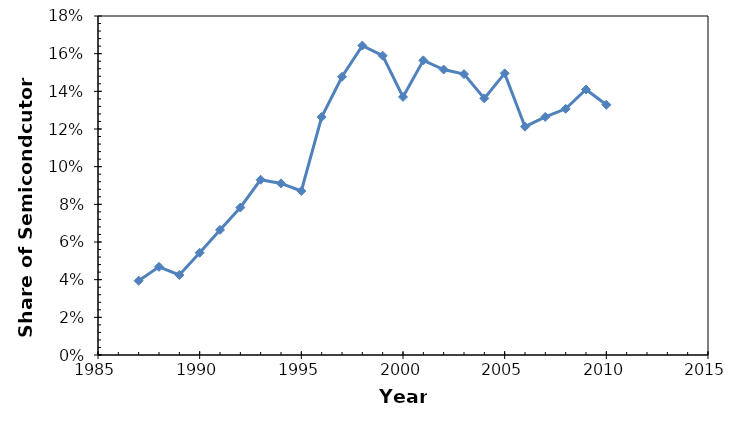
| Category | Series 0 |
|---|---|
| 1987.0 | 0.039 |
| 1988.0 | 0.047 |
| 1989.0 | 0.042 |
| 1990.0 | 0.054 |
| 1991.0 | 0.066 |
| 1992.0 | 0.078 |
| 1993.0 | 0.093 |
| 1994.0 | 0.091 |
| 1995.0 | 0.087 |
| 1996.0 | 0.126 |
| 1997.0 | 0.148 |
| 1998.0 | 0.164 |
| 1999.0 | 0.159 |
| 2000.0 | 0.137 |
| 2001.0 | 0.156 |
| 2002.0 | 0.152 |
| 2003.0 | 0.149 |
| 2004.0 | 0.136 |
| 2005.0 | 0.15 |
| 2006.0 | 0.121 |
| 2007.0 | 0.126 |
| 2008.0 | 0.131 |
| 2009.0 | 0.141 |
| 2010.0 | 0.133 |